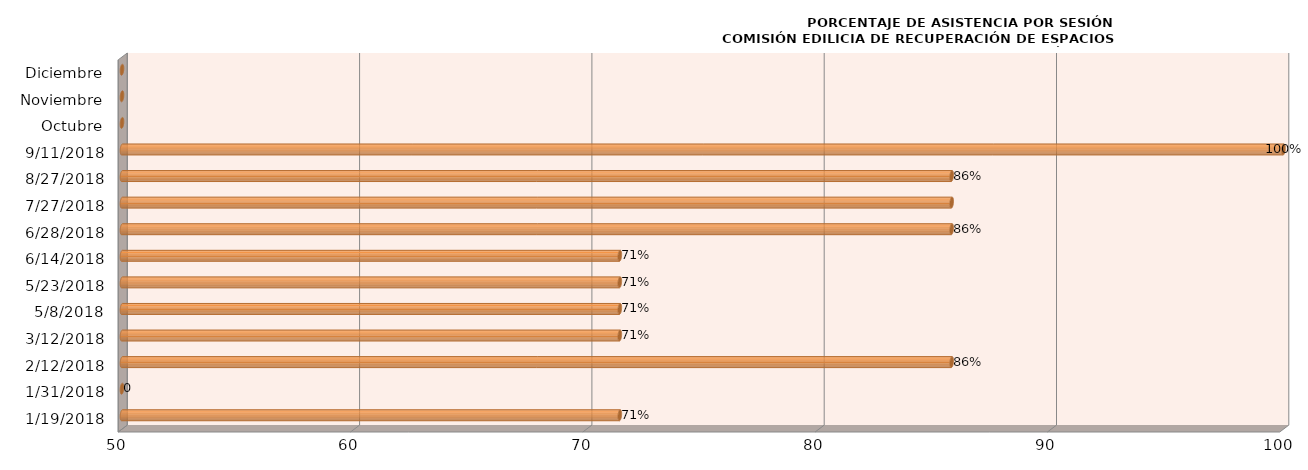
| Category | Series 0 |
|---|---|
| 19/01/2018 | 71.429 |
| 31/01/2018 | 0 |
| 12/02/2018 | 85.714 |
| 12/03/2018 | 71.429 |
| 08/05/2018 | 71.429 |
| 23/05/2018 | 71.429 |
| 14/06/2018 | 71.429 |
| 28/06/2018 | 85.714 |
| 27/07/2018 | 85.714 |
| 27/08/2018 | 85.714 |
| 11/09/2018 | 100 |
| Octubre | 0 |
| Noviembre | 0 |
| Diciembre | 0 |